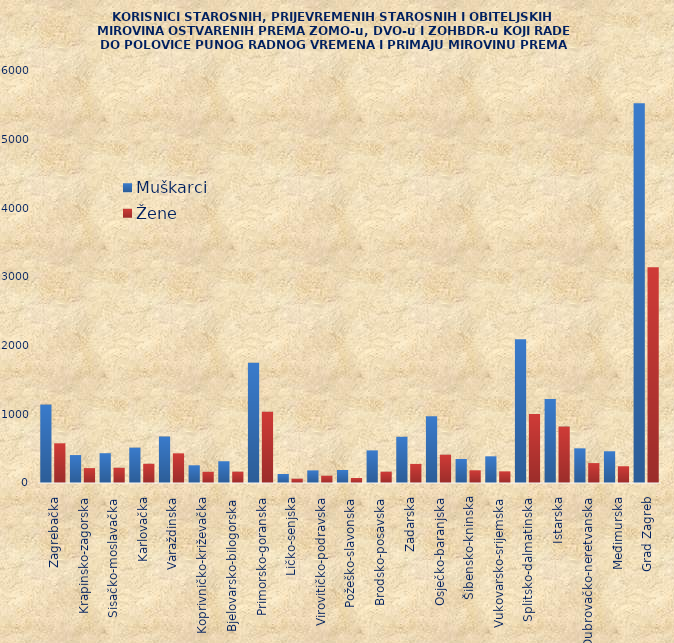
| Category | Muškarci | Žene |
|---|---|---|
| Zagrebačka | 1142 | 578 |
| Krapinsko-zagorska | 407 | 217 |
| Sisačko-moslavačka | 434 | 222 |
| Karlovačka | 515 | 280 |
| Varaždinska | 677 | 432 |
| Koprivničko-križevačka | 258 | 163 |
| Bjelovarsko-bilogorska | 317 | 165 |
| Primorsko-goranska | 1753 | 1039 |
| Ličko-senjska | 131 | 63 |
| Virovitičko-podravska | 184 | 106 |
| Požeško-slavonska | 189 | 73 |
| Brodsko-posavska | 475 | 165 |
| Zadarska | 673 | 278 |
| Osječko-baranjska | 973 | 412 |
| Šibensko-kninska | 350 | 185 |
| Vukovarsko-srijemska | 389 | 170 |
| Splitsko-dalmatinska | 2093 | 1005 |
| Istarska | 1224 | 822 |
| Dubrovačko-neretvanska | 505 | 290 |
| Međimurska | 462 | 244 |
| Grad Zagreb | 5532 | 3143 |